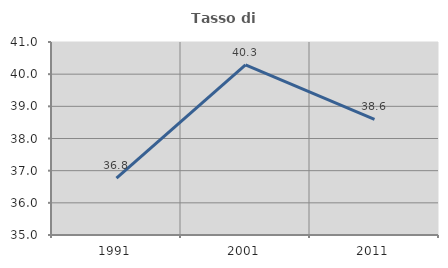
| Category | Tasso di occupazione   |
|---|---|
| 1991.0 | 36.77 |
| 2001.0 | 40.288 |
| 2011.0 | 38.596 |